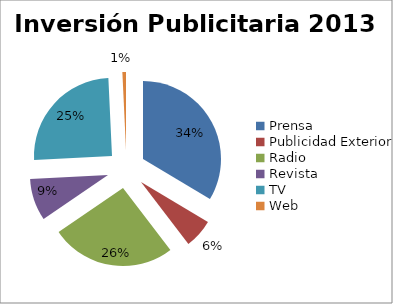
| Category | Series 0 |
|---|---|
| Prensa | 1756760131.2 |
| Publicidad Exterior | 315388939.342 |
| Radio | 1352641521.415 |
| Revista | 457618063.4 |
| TV | 1310699651.137 |
| Web | 38849800 |